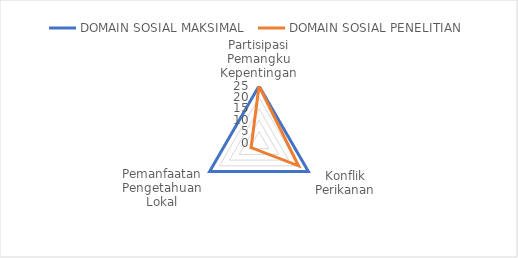
| Category | DOMAIN SOSIAL MAKSIMAL  | DOMAIN SOSIAL PENELITIAN  |
|---|---|---|
| Partisipasi Pemangku Kepentingan | 25 | 25 |
| Konflik Perikanan | 25 | 20 |
| Pemanfaatan Pengetahuan Lokal | 25 | 4 |